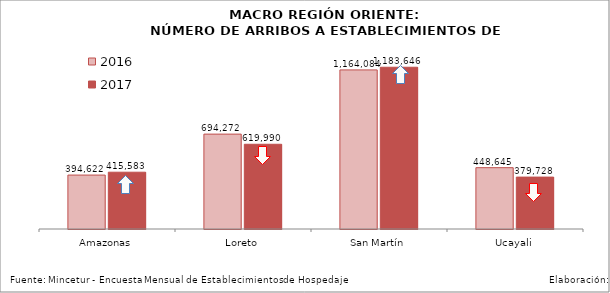
| Category | 2016 | 2017 |
|---|---|---|
| Amazonas | 394622 | 415583 |
| Loreto | 694272 | 619990 |
| San Martín | 1164084 | 1183646 |
| Ucayali | 448645 | 379728 |